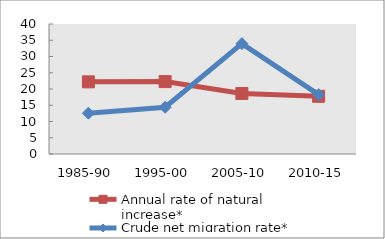
| Category | Annual rate of natural increase* | Crude net migration rate* |
|---|---|---|
| 1985-90 | 22.2 | 12.557 |
| 1995-00 | 22.287 | 14.377 |
| 2005-10 | 18.633 | 33.961 |
| 2010-15 | 17.754 | 18.251 |